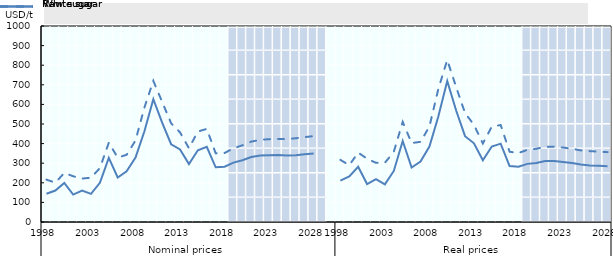
| Category | Projected1 | Projected2 | Projected3 | Projected4 | Projected5 | Projected6 | Projected7 | Projected8 |
|---|---|---|---|---|---|---|---|---|
| 0 | 0 | 0 | 0 | 0 | 0 | 0 | 0 | 0 |
| 1 | 0 | 0 | 0 | 0 | 0 | 0 | 0 | 0 |
| 2 | 0 | 0 | 0 | 0 | 0 | 0 | 0 | 0 |
| 3 | 0 | 0 | 0 | 0 | 0 | 0 | 0 | 0 |
| 4 | 0 | 0 | 0 | 0 | 0 | 0 | 0 | 0 |
| 5 | 0 | 0 | 0 | 0 | 0 | 0 | 0 | 0 |
| 6 | 0 | 0 | 0 | 0 | 0 | 0 | 0 | 0 |
| 7 | 0 | 0 | 0 | 0 | 0 | 0 | 0 | 0 |
| 8 | 0 | 0 | 0 | 0 | 0 | 0 | 0 | 0 |
| 9 | 0 | 0 | 0 | 0 | 0 | 0 | 0 | 0 |
| 10 | 0 | 0 | 0 | 0 | 0 | 0 | 0 | 0 |
| 11 | 0 | 0 | 0 | 0 | 0 | 0 | 0 | 0 |
| 12 | 0 | 0 | 0 | 0 | 0 | 0 | 0 | 0 |
| 13 | 0 | 0 | 0 | 0 | 0 | 0 | 0 | 0 |
| 14 | 0 | 0 | 0 | 0 | 0 | 0 | 0 | 0 |
| 15 | 0 | 0 | 0 | 0 | 0 | 0 | 0 | 0 |
| 16 | 0 | 0 | 0 | 0 | 0 | 0 | 0 | 0 |
| 17 | 0 | 0 | 0 | 0 | 0 | 0 | 0 | 0 |
| 18 | 0 | 0 | 0 | 0 | 0 | 0 | 0 | 0 |
| 19 | 0 | 0 | 0 | 0 | 0 | 0 | 0 | 0 |
| 20 | 0 | 0 | 0 | 0 | 0 | 0 | 0 | 0 |
| 21 | 1 | 1 | 1 | 1 | 1 | 1 | 1 | 0.95 |
| 22 | 1 | 1 | 1 | 1 | 1 | 1 | 1 | 0.95 |
| 23 | 1 | 1 | 1 | 1 | 1 | 1 | 1 | 0.95 |
| 24 | 1 | 1 | 1 | 1 | 1 | 1 | 1 | 0.95 |
| 25 | 1 | 1 | 1 | 1 | 1 | 1 | 1 | 0.95 |
| 26 | 1 | 1 | 1 | 1 | 1 | 1 | 1 | 0.95 |
| 27 | 1 | 1 | 1 | 1 | 1 | 1 | 1 | 0.95 |
| 28 | 1 | 1 | 1 | 1 | 1 | 1 | 1 | 0.95 |
| 29 | 1 | 1 | 1 | 1 | 1 | 1 | 1 | 0.95 |
| 30 | 1 | 1 | 1 | 1 | 1 | 1 | 1 | 0.95 |
| 31 | 1 | 1 | 1 | 1 | 1 | 1 | 1 | 0.95 |
| 32 | 0 | 0 | 0 | 0 | 0 | 0 | 0 | 0 |
| 33 | 0 | 0 | 0 | 0 | 0 | 0 | 0 | 0 |
| 34 | 0 | 0 | 0 | 0 | 0 | 0 | 0 | 0 |
| 35 | 0 | 0 | 0 | 0 | 0 | 0 | 0 | 0 |
| 36 | 0 | 0 | 0 | 0 | 0 | 0 | 0 | 0 |
| 37 | 0 | 0 | 0 | 0 | 0 | 0 | 0 | 0 |
| 38 | 0 | 0 | 0 | 0 | 0 | 0 | 0 | 0 |
| 39 | 0 | 0 | 0 | 0 | 0 | 0 | 0 | 0 |
| 40 | 0 | 0 | 0 | 0 | 0 | 0 | 0 | 0 |
| 41 | 0 | 0 | 0 | 0 | 0 | 0 | 0 | 0 |
| 42 | 0 | 0 | 0 | 0 | 0 | 0 | 0 | 0 |
| 43 | 0 | 0 | 0 | 0 | 0 | 0 | 0 | 0 |
| 44 | 0 | 0 | 0 | 0 | 0 | 0 | 0 | 0 |
| 45 | 0 | 0 | 0 | 0 | 0 | 0 | 0 | 0 |
| 46 | 0 | 0 | 0 | 0 | 0 | 0 | 0 | 0 |
| 47 | 0 | 0 | 0 | 0 | 0 | 0 | 0 | 0 |
| 48 | 0 | 0 | 0 | 0 | 0 | 0 | 0 | 0 |
| 49 | 0 | 0 | 0 | 0 | 0 | 0 | 0 | 0 |
| 50 | 0 | 0 | 0 | 0 | 0 | 0 | 0 | 0 |
| 51 | 0 | 0 | 0 | 0 | 0 | 0 | 0 | 0 |
| 52 | 0 | 0 | 0 | 0 | 0 | 0 | 0 | 0 |
| 53 | 0 | 0 | 0 | 0 | 0 | 0 | 0 | 0 |
| 54 | 1 | 1 | 1 | 1 | 1 | 1 | 1 | 0.95 |
| 55 | 1 | 1 | 1 | 1 | 1 | 1 | 1 | 0.95 |
| 56 | 1 | 1 | 1 | 1 | 1 | 1 | 1 | 0.95 |
| 57 | 1 | 1 | 1 | 1 | 1 | 1 | 1 | 0.95 |
| 58 | 1 | 1 | 1 | 1 | 1 | 1 | 1 | 0.95 |
| 59 | 1 | 1 | 1 | 1 | 1 | 1 | 1 | 0.95 |
| 60 | 1 | 1 | 1 | 1 | 1 | 1 | 1 | 0.95 |
| 61 | 1 | 1 | 1 | 1 | 1 | 1 | 1 | 0.95 |
| 62 | 1 | 1 | 1 | 1 | 1 | 1 | 1 | 0.95 |
| 63 | 1 | 1 | 1 | 1 | 1 | 1 | 1 | 0.95 |